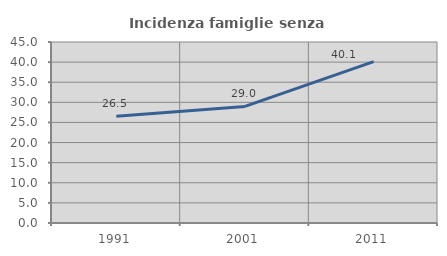
| Category | Incidenza famiglie senza nuclei |
|---|---|
| 1991.0 | 26.539 |
| 2001.0 | 28.976 |
| 2011.0 | 40.109 |